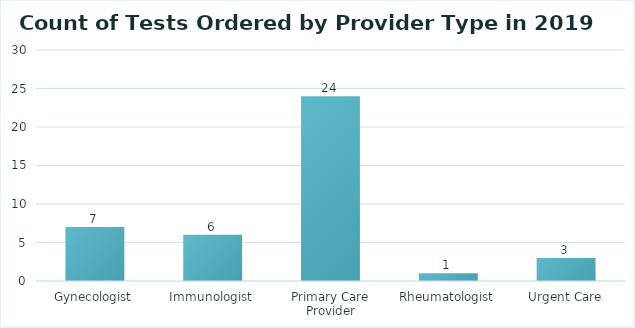
| Category | Count of Tests Ordered |
|---|---|
| Gynecologist | 7 |
| Immunologist | 6 |
| Primary Care Provider | 24 |
| Rheumatologist | 1 |
| Urgent Care | 3 |